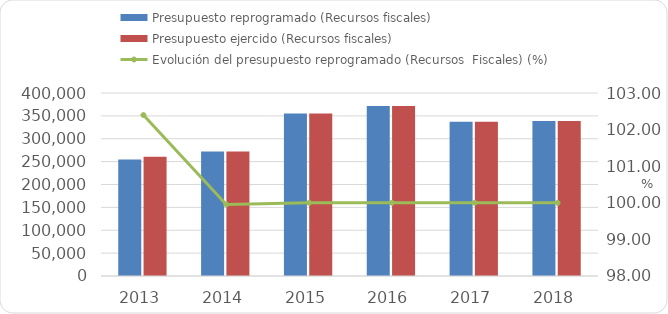
| Category | Presupuesto reprogramado (Recursos fiscales) | Presupuesto ejercido (Recursos fiscales)  |
|---|---|---|
| 2013 | 254564.7 | 260665.1 |
| 2014 | 271990.9 | 271865.4 |
| 2015 | 355160.2 | 355160.2 |
| 2016 | 371403.9 | 371403.9 |
| 2017 | 337092.5 | 337092.5 |
| 2018 | 338675 | 338675 |